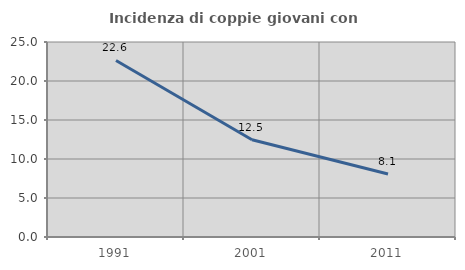
| Category | Incidenza di coppie giovani con figli |
|---|---|
| 1991.0 | 22.634 |
| 2001.0 | 12.461 |
| 2011.0 | 8.086 |